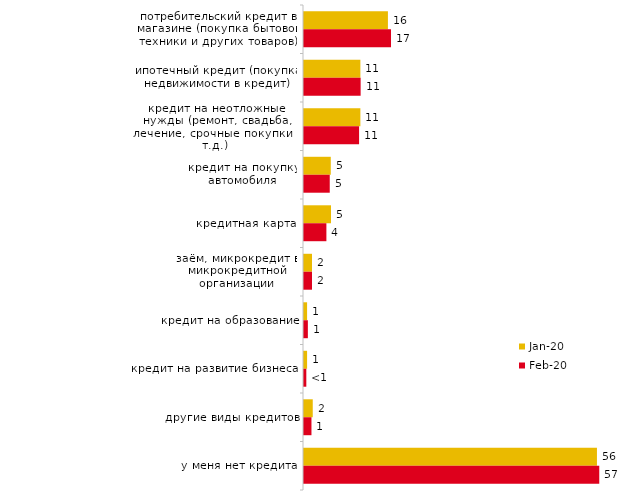
| Category | янв.20 | фев.20 |
|---|---|---|
| потребительский кредит в магазине (покупка бытовой техники и других товаров) | 16.139 | 16.733 |
| ипотечный кредит (покупка недвижимости в кредит) | 10.842 | 10.891 |
| кредит на неотложные нужды (ремонт, свадьба, лечение, срочные покупки и т.д.) | 10.842 | 10.594 |
| кредит на покупку автомобиля | 5.149 | 4.95 |
| кредитная карта | 5.198 | 4.307 |
| заём, микрокредит в микрокредитной организации | 1.535 | 1.535 |
| кредит на образование | 0.594 | 0.743 |
| кредит на развитие бизнеса | 0.594 | 0.446 |
| другие виды кредитов | 1.683 | 1.436 |
| у меня нет кредита | 56.337 | 56.782 |